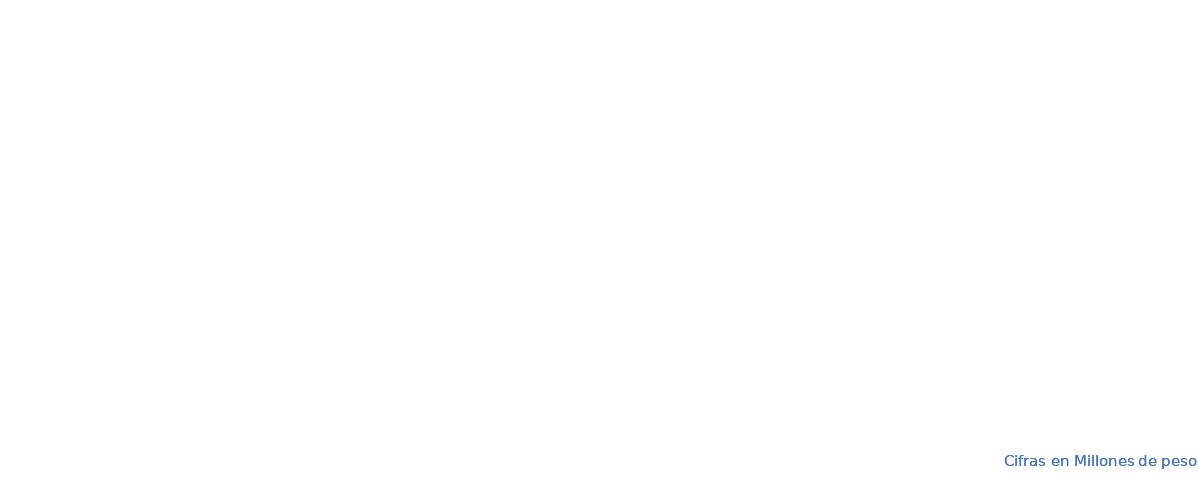
| Category | APROPIACION | COMPROMISOS |  OBLIGACIONES |  PAGOS |
|---|---|---|---|---|
| A-FUNCIONAMIENTO | 99785.985 | 53939.562 | 50393.639 | 49353.25 |
| B-SERVICIO DE LA DEUDA PÚBLICA | 1167604.335 | 792516.304 | 792516.304 | 792516.304 |
| C- INVERSION | 4505182.025 | 4344239.511 | 368798.635 | 366393.217 |